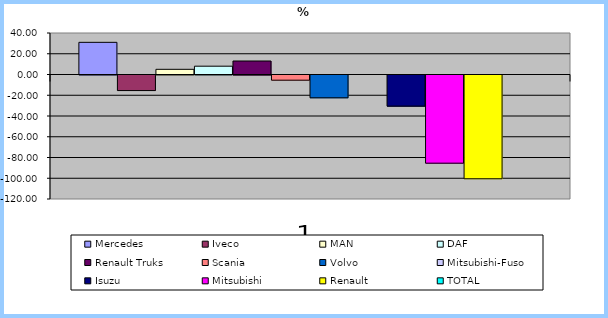
| Category | Mercedes | Iveco | MAN | DAF | Renault Truks | Scania | Volvo | Mitsubishi-Fuso | Isuzu | Mitsubishi | Renault | TOTAL |
|---|---|---|---|---|---|---|---|---|---|---|---|---|
| 0 | 31 | -15 | 5 | 8 | 13 | -5 | -22 | 0 | -30 | -85 | -100 | 0 |